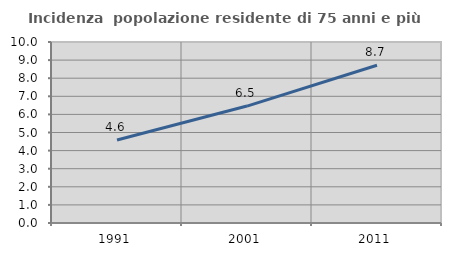
| Category | Incidenza  popolazione residente di 75 anni e più |
|---|---|
| 1991.0 | 4.585 |
| 2001.0 | 6.46 |
| 2011.0 | 8.717 |